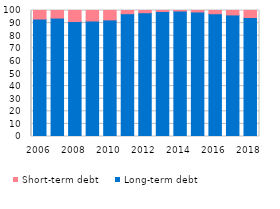
| Category | Long-term debt | Short-term debt |
|---|---|---|
| 2006 | 93.225 | 6.775 |
| 2007 | 93.994 | 6.006 |
| 2008 | 91.269 | 8.731 |
| 2009 | 91.683 | 8.317 |
| 2010 | 92.524 | 7.476 |
| 2011 | 97.465 | 2.535 |
| 2012 | 98.226 | 1.774 |
| 2013 | 99.234 | 0.766 |
| 2014 | 99.616 | 0.384 |
| 2015 | 98.846 | 1.154 |
| 2016 | 97.448 | 2.552 |
| 2017 | 96.488 | 3.512 |
| 2018 | 94.424 | 5.576 |